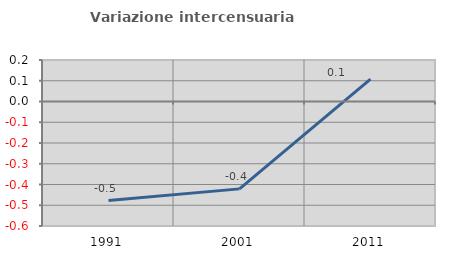
| Category | Variazione intercensuaria annua |
|---|---|
| 1991.0 | -0.477 |
| 2001.0 | -0.421 |
| 2011.0 | 0.108 |